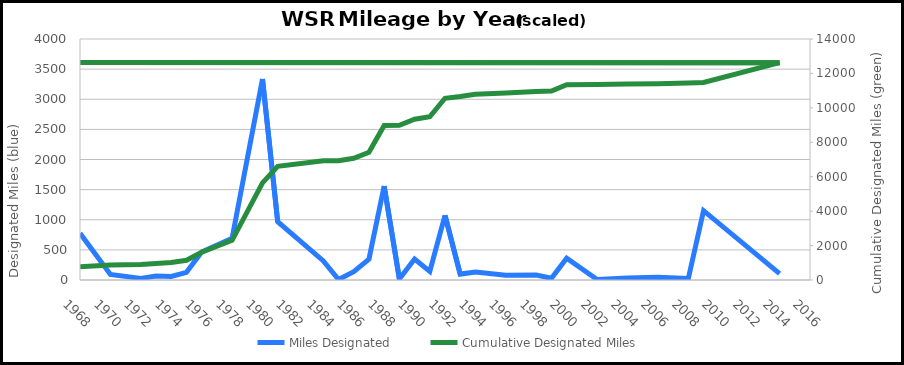
| Category | Miles Designated |
|---|---|
| 1968.0 | 775.2 |
| 1970.0 | 92.5 |
| 1972.0 | 27 |
| 1973.0 | 66 |
| 1974.0 | 58.7 |
| 1975.0 | 127.3 |
| 1976.0 | 464.8 |
| 1978.0 | 693.1 |
| 1980.0 | 3335 |
| 1981.0 | 967 |
| 1984.0 | 316.9 |
| 1985.0 | 7.6 |
| 1986.0 | 138.7 |
| 1987.0 | 346.5 |
| 1988.0 | 1558.5 |
| 1989.0 | 17.1 |
| 1990.0 | 348.4 |
| 1991.0 | 143 |
| 1992.0 | 1073.9 |
| 1993.0 | 98.1 |
| 1994.0 | 134.1 |
| 1996.0 | 79.6 |
| 1998.0 | 81 |
| 1999.0 | 29 |
| 2000.0 | 362.9 |
| 2002.0 | 8.9 |
| 2004.0 | 34.8 |
| 2006.0 | 45.2 |
| 2008.0 | 25.3 |
| 2009.0 | 1150.7 |
| 2014.0 | 106.7 |